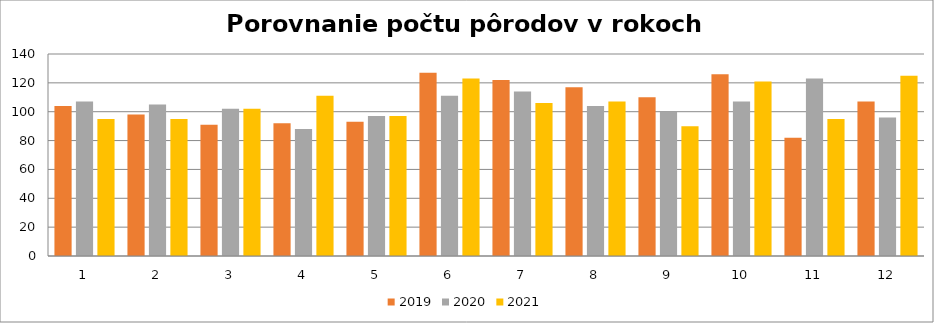
| Category | 2019 | 2020 | 2021 |
|---|---|---|---|
| 0 | 104 | 107 | 95 |
| 1 | 98 | 105 | 95 |
| 2 | 91 | 102 | 102 |
| 3 | 92 | 88 | 111 |
| 4 | 93 | 97 | 97 |
| 5 | 127 | 111 | 123 |
| 6 | 122 | 114 | 106 |
| 7 | 117 | 104 | 107 |
| 8 | 110 | 100 | 90 |
| 9 | 126 | 107 | 121 |
| 10 | 82 | 123 | 95 |
| 11 | 107 | 96 | 125 |